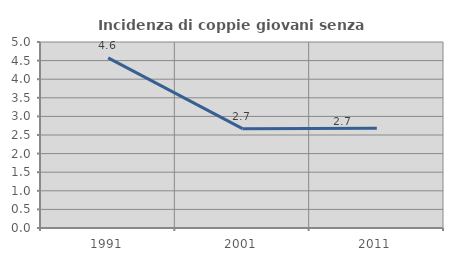
| Category | Incidenza di coppie giovani senza figli |
|---|---|
| 1991.0 | 4.575 |
| 2001.0 | 2.671 |
| 2011.0 | 2.683 |